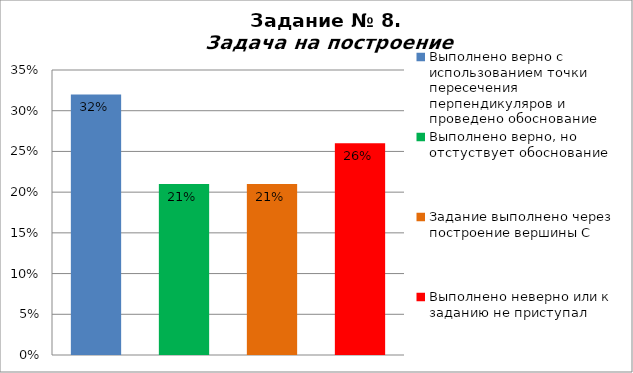
| Category | Задача на построение |
|---|---|
| Выполнено верно с использованием точки пересечения перпендикуляров и проведено обоснование | 0.32 |
| Выполнено верно, но отстуствует обоснование | 0.21 |
| Задание выполнено через построение вершины С | 0.21 |
| Выполнено неверно или к заданию не приступал | 0.26 |